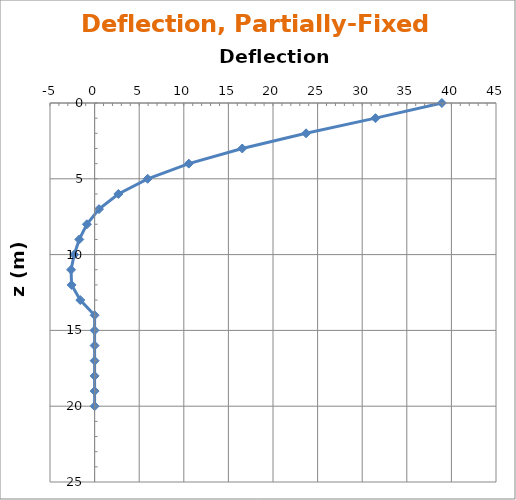
| Category | 0.5 |
|---|---|
| 38.931677387272686 | 0 |
| 31.48942848032247 | 1 |
| 23.708295453671447 | 2 |
| 16.551426975950893 | 3 |
| 10.562377221304297 | 4 |
| 5.948397787789554 | 5 |
| 2.663729615781211 | 6 |
| 0.4928949063726196 | 7 |
| -0.8660109602218453 | 8 |
| -1.7180275062644712 | 9 |
| -2.2880372380921825 | 10 |
| -2.6374737277141334 | 11 |
| -2.5810296944097204 | 12 |
| -1.6033650863262372 | 13 |
| 0.0 | 14 |
| 0.0 | 15 |
| 0.0 | 16 |
| 0.0 | 17 |
| 0.0 | 18 |
| 0.0 | 19 |
| 0.0 | 20 |